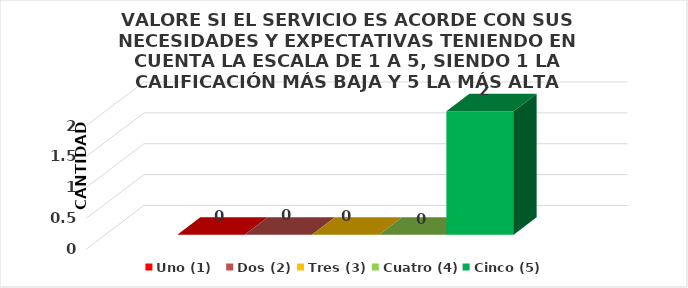
| Category | Uno (1)   | Dos (2) | Tres (3) | Cuatro (4) | Cinco (5) |
|---|---|---|---|---|---|
| 0 | 0 | 0 | 0 | 0 | 2 |